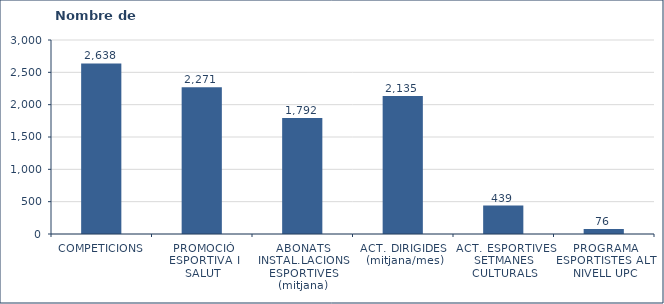
| Category | Nombre de participants |
|---|---|
| COMPETICIONS | 2638 |
| PROMOCIÓ ESPORTIVA I SALUT | 2271 |
| ABONATS INSTAL.LACIONS ESPORTIVES (mitjana) | 1792 |
| ACT. DIRIGIDES  (mitjana/mes) | 2135 |
| ACT. ESPORTIVES SETMANES CULTURALS | 439 |
| PROGRAMA ESPORTISTES ALT NIVELL UPC | 76 |